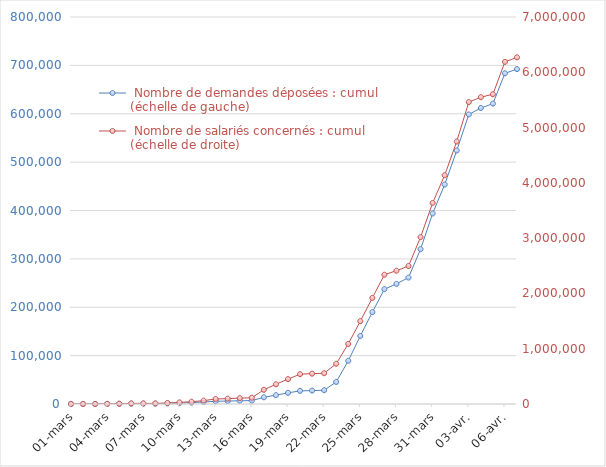
| Category |  Nombre de demandes déposées : cumul (échelle de gauche) |
|---|---|
| 01-mars | 24 |
| 02-mars | 48 |
| 03-mars | 121 |
| 04-mars | 235 |
| 05-mars | 429 |
| 06-mars | 779 |
| 07-mars | 792 |
| 08-mars | 803 |
| 09-mars | 1283 |
| 10-mars | 1951 |
| 11-mars | 2878 |
| 12-mars | 4150 |
| 13-mars | 5672 |
| 14-mars | 6085 |
| 15-mars | 6658 |
| 16-mars | 6950 |
| 17-mars | 13869 |
| 18-mars | 18264 |
| 19-mars | 23051 |
| 20-mars | 27095 |
| 21-mars | 27685 |
| 22-mars | 28430 |
| 23-mars | 45553 |
| 24-mars | 89235 |
| 25-mars | 140571 |
| 26-mars | 189954 |
| 27-mars | 237297 |
| 28-mars | 248330 |
| 29-mars | 261292 |
| 30-mars | 320079 |
| 31-mars | 393830 |
| 01-avr. | 453571 |
| 02-avr. | 523899 |
| 03-avr. | 598562 |
| 04-avr. | 611873 |
| 05-avr. | 620891 |
| 06-avr. | 683564 |
| 07-avr. | 692260 |